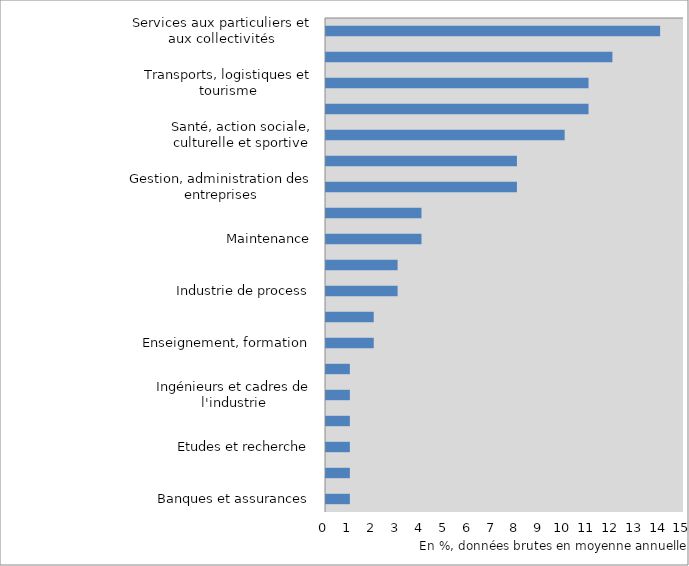
| Category | Series 0 |
|---|---|
| Services aux particuliers et aux collectivités | 14 |
| Commerce | 12 |
| Transports, logistiques et tourisme | 11 |
| Hôtellerie, restauration, alimentation | 11 |
| Santé, action sociale, culturelle et sportive | 10 |
| Bâtiment, travaux publics | 8 |
| Gestion, administration des entreprises | 8 |
| Agriculture, marine, pêche | 4 |
| Maintenance | 4 |
| Mécanique, travail des métaux | 3 |
| Industrie de process | 3 |
| Communication, information, art et spectacle | 2 |
| Enseignement, formation | 2 |
| Matériaux souples, bois, industries graphiques | 1 |
| Ingénieurs et cadres de l'industrie | 1 |
| Informatique et télécommunications | 1 |
| Etudes et recherche | 1 |
| Administration publique, profession juridique, armé et police | 1 |
| Banques et assurances | 1 |